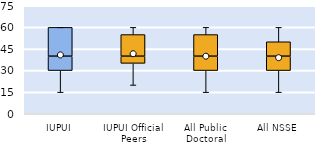
| Category | 25th | 50th | 75th |
|---|---|---|---|
| IUPUI | 30 | 10 | 20 |
| IUPUI Official Peers | 35 | 5 | 15 |
| All Public Doctoral | 30 | 10 | 15 |
| All NSSE | 30 | 10 | 10 |